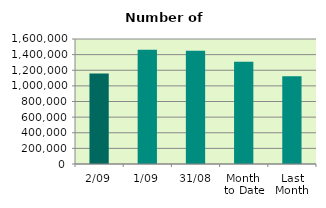
| Category | Series 0 |
|---|---|
| 2/09 | 1158544 |
| 1/09 | 1461322 |
| 31/08 | 1449962 |
| Month 
to Date | 1309933 |
| Last
Month | 1124493.364 |